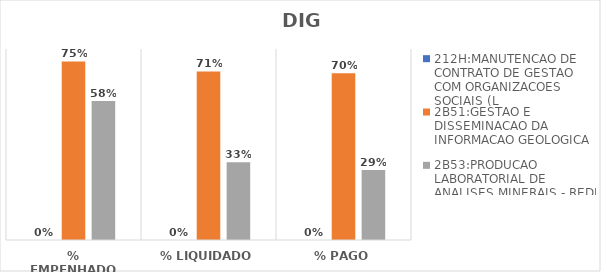
| Category | 212H:MANUTENCAO DE CONTRATO DE GESTAO COM ORGANIZACOES SOCIAIS (L | 2B51:GESTAO E DISSEMINACAO DA INFORMACAO GEOLOGICA | 2B53:PRODUCAO LABORATORIAL DE ANALISES MINERAIS - REDE LAMIN |
|---|---|---|---|
| % EMPENHADO | 0 | 0.748 | 0.583 |
| % LIQUIDADO | 0 | 0.706 | 0.325 |
| % PAGO | 0 | 0.698 | 0.293 |